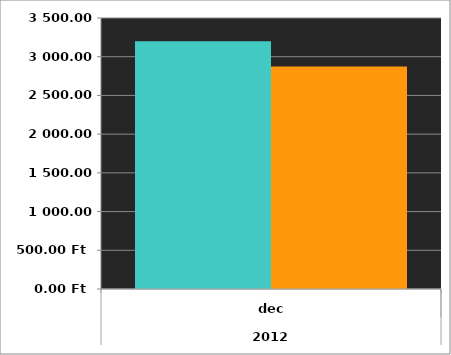
| Category | Bevétel | Kiadás |
|---|---|---|
| 0 | 3200 | 2874 |